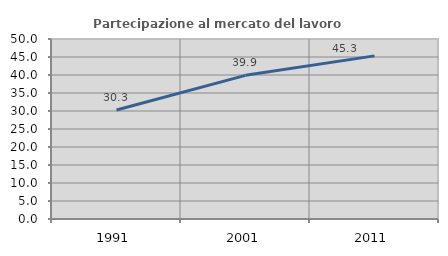
| Category | Partecipazione al mercato del lavoro  femminile |
|---|---|
| 1991.0 | 30.283 |
| 2001.0 | 39.905 |
| 2011.0 | 45.308 |